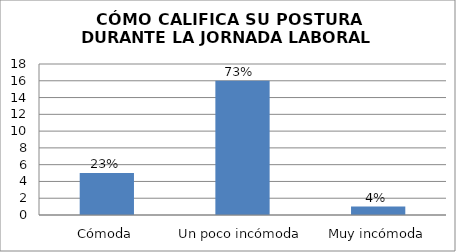
| Category | Cantidad de Persons |
|---|---|
| Cómoda | 5 |
| Un poco incómoda | 16 |
| Muy incómoda | 1 |